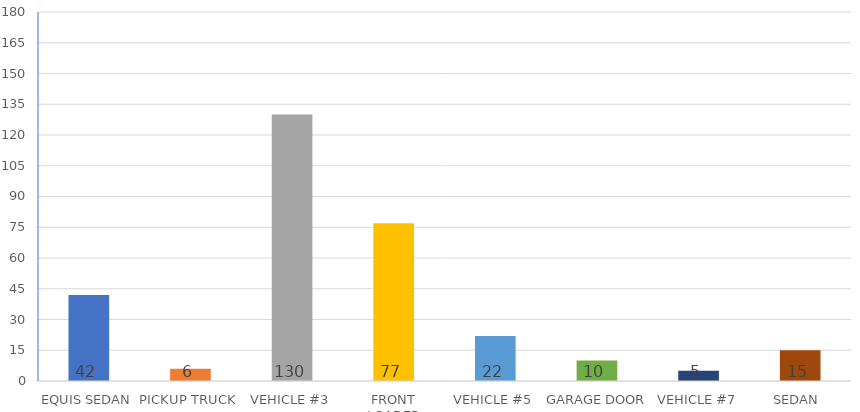
| Category | DOWNTIME 
(IN MINUTES) |
|---|---|
| EQUIS SEDAN | 42 |
| PICKUP TRUCK | 6 |
| VEHICLE #3 | 130 |
| FRONT LOADER | 77 |
| VEHICLE #5 | 22 |
| GARAGE DOOR | 10 |
| VEHICLE #7 | 5 |
| SEDAN  | 15 |